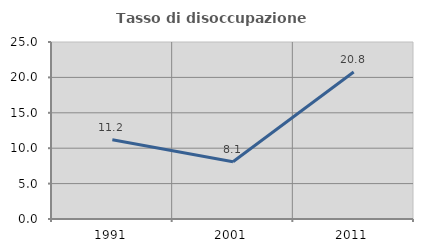
| Category | Tasso di disoccupazione giovanile  |
|---|---|
| 1991.0 | 11.194 |
| 2001.0 | 8.081 |
| 2011.0 | 20.755 |